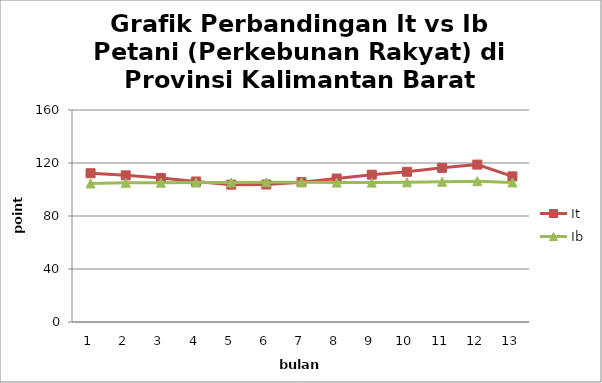
| Category | It | Ib |
|---|---|---|
| 0 | 112.27 | 104.56 |
| 1 | 110.67 | 105.05 |
| 2 | 108.65 | 105.14 |
| 3 | 106.06 | 105.25 |
| 4 | 103.67 | 105.28 |
| 5 | 103.78 | 105.44 |
| 6 | 105.56 | 105.41 |
| 7 | 108.3 | 105.19 |
| 8 | 111.2 | 105.19 |
| 9 | 113.38 | 105.44 |
| 10 | 116.33 | 105.8 |
| 11 | 118.78 | 106.28 |
| 12 | 109.887 | 105.336 |